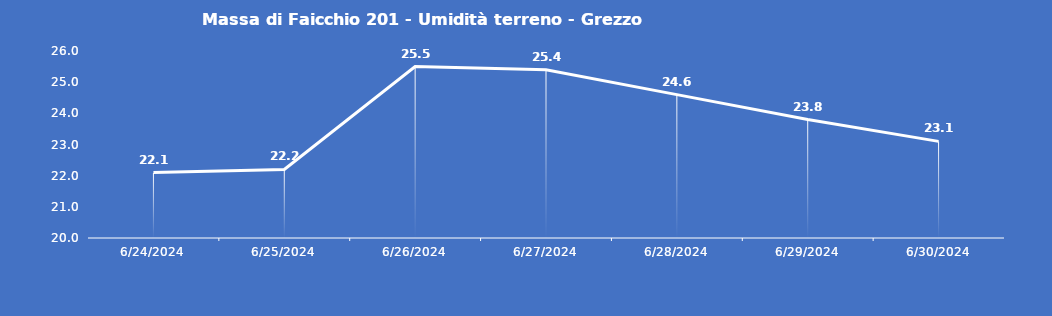
| Category | Massa di Faicchio 201 - Umidità terreno - Grezzo (%VWC) |
|---|---|
| 6/24/24 | 22.1 |
| 6/25/24 | 22.2 |
| 6/26/24 | 25.5 |
| 6/27/24 | 25.4 |
| 6/28/24 | 24.6 |
| 6/29/24 | 23.8 |
| 6/30/24 | 23.1 |